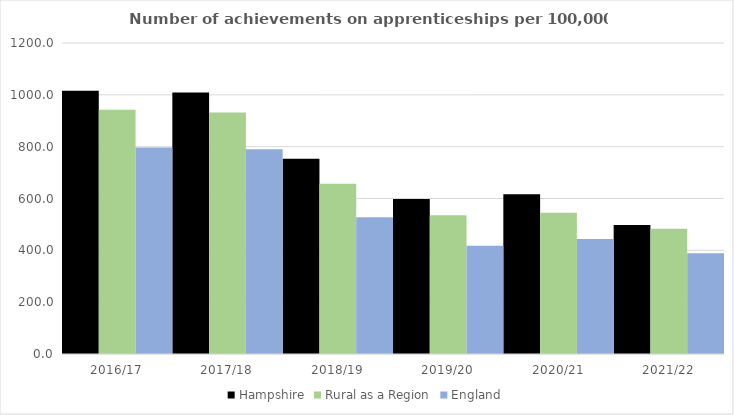
| Category | Hampshire | Rural as a Region | England |
|---|---|---|---|
| 2016/17 | 1015.857 | 942.594 | 797 |
| 2017/18 | 1008.781 | 931.709 | 790 |
| 2018/19 | 753.242 | 656.44 | 528 |
| 2019/20 | 598.065 | 535.552 | 418 |
| 2020/21 | 616.553 | 545.333 | 444 |
| 2021/22 | 498.203 | 482.936 | 389 |